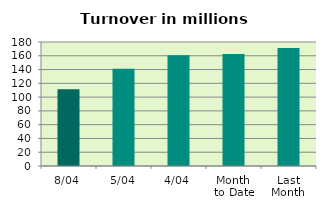
| Category | Series 0 |
|---|---|
| 8/04 | 111.52 |
| 5/04 | 141.171 |
| 4/04 | 160.791 |
| Month 
to Date | 162.576 |
| Last
Month | 171.15 |